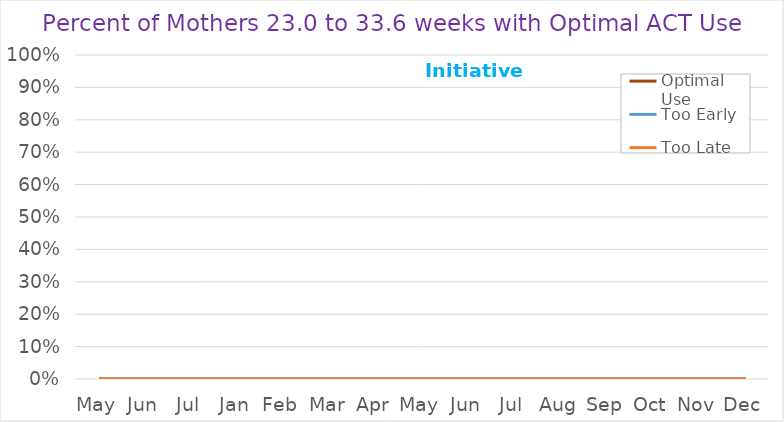
| Category | Optimal Use | Too Early | Too Late |
|---|---|---|---|
| May | 0 | 0 | 0 |
| Jun | 0 | 0 | 0 |
| Jul | 0 | 0 | 0 |
| Jan | 0 | 0 | 0 |
| Feb | 0 | 0 | 0 |
| Mar | 0 | 0 | 0 |
| Apr | 0 | 0 | 0 |
| May | 0 | 0 | 0 |
| Jun | 0 | 0 | 0 |
| Jul | 0 | 0 | 0 |
| Aug | 0 | 0 | 0 |
| Sep | 0 | 0 | 0 |
| Oct | 0 | 0 | 0 |
| Nov | 0 | 0 | 0 |
| Dec | 0 | 0 | 0 |